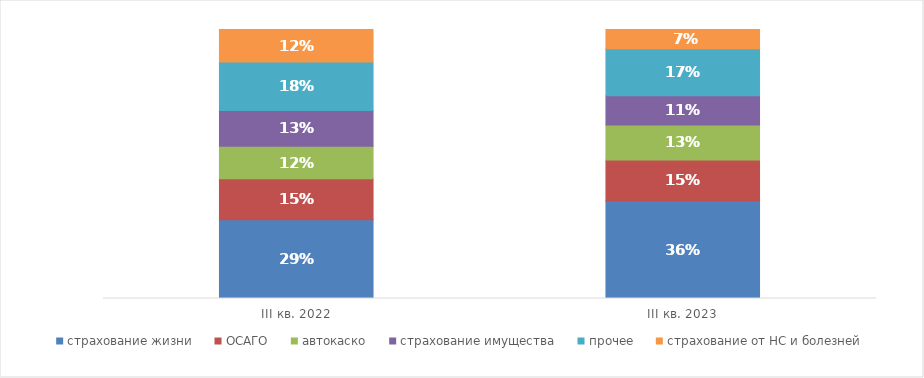
| Category | страхование жизни | ОСАГО | автокаско | страхование имущества | прочее | страхование от НС и болезней |
|---|---|---|---|---|---|---|
| III кв. 2022 | 0.293 | 0.152 | 0.121 | 0.133 | 0.18 | 0.121 |
| III кв. 2023 | 0.363 | 0.152 | 0.131 | 0.108 | 0.175 | 0.072 |